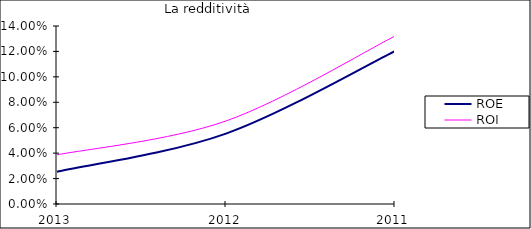
| Category | ROE | ROI |
|---|---|---|
| 2013.0 | 0.025 | 0.039 |
| 2012.0 | 0.055 | 0.065 |
| 2011.0 | 0.12 | 0.132 |